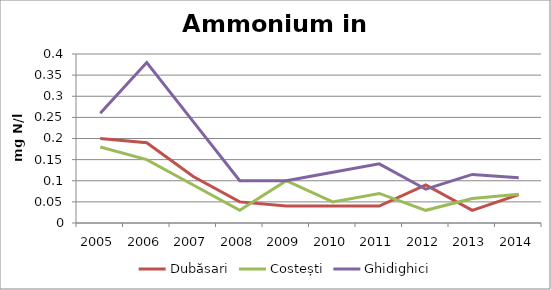
| Category | Dubăsari | Costești | Ghidighici |
|---|---|---|---|
| 2005.0 | 0.2 | 0.18 | 0.26 |
| 2006.0 | 0.19 | 0.15 | 0.38 |
| 2007.0 | 0.11 | 0.09 | 0.24 |
| 2008.0 | 0.05 | 0.03 | 0.1 |
| 2009.0 | 0.04 | 0.1 | 0.1 |
| 2010.0 | 0.04 | 0.05 | 0.12 |
| 2011.0 | 0.04 | 0.07 | 0.14 |
| 2012.0 | 0.09 | 0.03 | 0.08 |
| 2013.0 | 0.03 | 0.058 | 0.115 |
| 2014.0 | 0.067 | 0.068 | 0.107 |